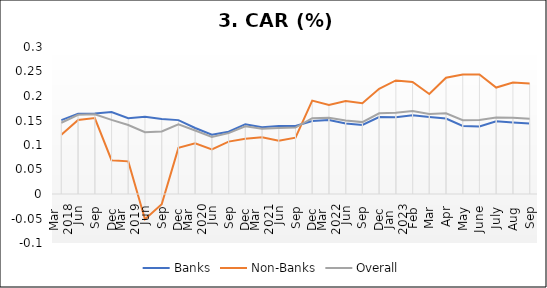
| Category | Banks | Non-Banks | Overall |
|---|---|---|---|
| 0 | 0.151 | 0.121 | 0.145 |
| 1 | 0.164 | 0.151 | 0.162 |
| 2 | 0.164 | 0.155 | 0.163 |
| 3 | 0.167 | 0.069 | 0.151 |
| 4 | 0.155 | 0.067 | 0.141 |
| 5 | 0.158 | -0.051 | 0.126 |
| 6 | 0.153 | -0.021 | 0.128 |
| 7 | 0.151 | 0.094 | 0.142 |
| 8 | 0.135 | 0.103 | 0.13 |
| 9 | 0.121 | 0.091 | 0.116 |
| 10 | 0.127 | 0.107 | 0.124 |
| 11 | 0.142 | 0.113 | 0.138 |
| 12 | 0.136 | 0.116 | 0.133 |
| 13 | 0.139 | 0.109 | 0.134 |
| 14 | 0.139 | 0.115 | 0.136 |
| 15 | 0.149 | 0.191 | 0.155 |
| 16 | 0.151 | 0.182 | 0.156 |
| 17 | 0.144 | 0.19 | 0.15 |
| 18 | 0.141 | 0.185 | 0.147 |
| 19 | 0.157 | 0.215 | 0.165 |
| 20 | 0.156 | 0.232 | 0.166 |
| 21 | 0.161 | 0.229 | 0.169 |
| 22 | 0.157 | 0.204 | 0.163 |
| 23 | 0.154 | 0.237 | 0.165 |
| 24 | 0.139 | 0.244 | 0.151 |
| 25 | 0.138 | 0.244 | 0.151 |
| 26 | 0.148 | 0.217 | 0.156 |
| 27 | 0.146 | 0.228 | 0.156 |
| 28 | 0.144 | 0.226 | 0.153 |